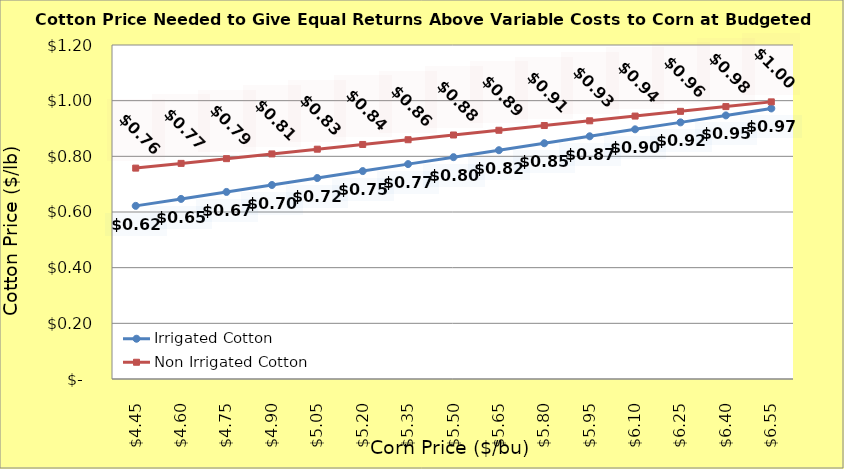
| Category | Irrigated Cotton | Non Irrigated Cotton |
|---|---|---|
| 4.4499999999999975 | 0.622 | 0.758 |
| 4.599999999999998 | 0.647 | 0.775 |
| 4.749999999999998 | 0.672 | 0.792 |
| 4.899999999999999 | 0.697 | 0.809 |
| 5.049999999999999 | 0.722 | 0.826 |
| 5.199999999999999 | 0.747 | 0.843 |
| 5.35 | 0.772 | 0.86 |
| 5.5 | 0.797 | 0.877 |
| 5.65 | 0.822 | 0.894 |
| 5.800000000000001 | 0.847 | 0.911 |
| 5.950000000000001 | 0.872 | 0.928 |
| 6.100000000000001 | 0.897 | 0.945 |
| 6.250000000000002 | 0.922 | 0.962 |
| 6.400000000000002 | 0.947 | 0.979 |
| 6.5500000000000025 | 0.972 | 0.996 |